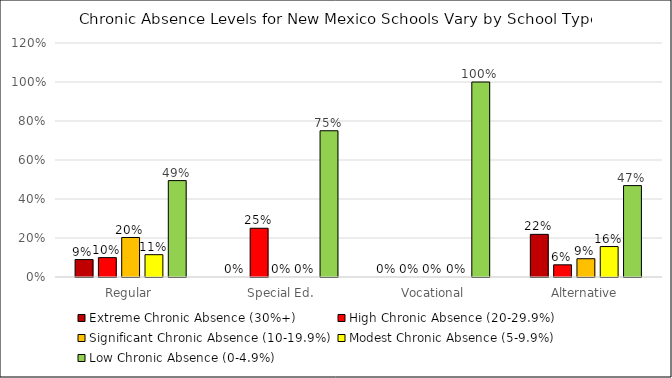
| Category | Extreme Chronic Absence (30%+) | High Chronic Absence (20-29.9%) | Significant Chronic Absence (10-19.9%) | Modest Chronic Absence (5-9.9%) | Low Chronic Absence (0-4.9%) |
|---|---|---|---|---|---|
| Regular | 0.089 | 0.099 | 0.203 | 0.114 | 0.494 |
| Special Ed. | 0 | 0.25 | 0 | 0 | 0.75 |
| Vocational | 0 | 0 | 0 | 0 | 1 |
| Alternative | 0.219 | 0.062 | 0.094 | 0.156 | 0.469 |